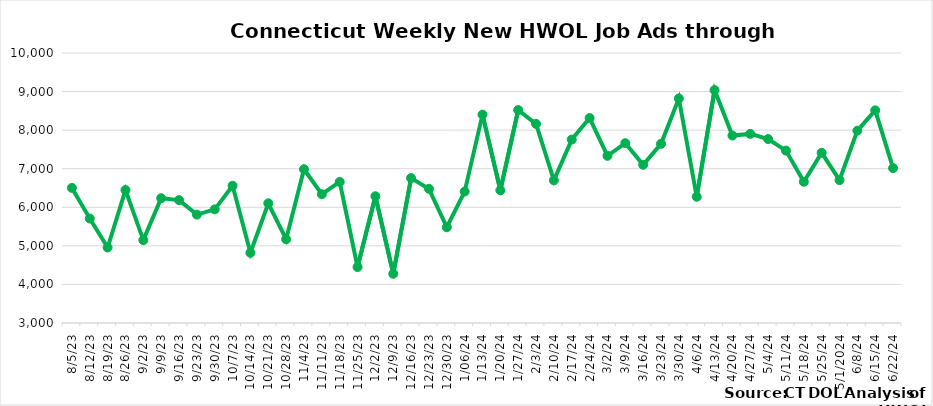
| Category | Connecticut |
|---|---|
| 8/5/23 | 6503 |
| 8/12/23 | 5708 |
| 8/19/23 | 4958 |
| 8/26/23 | 6447 |
| 9/2/23 | 5149 |
| 9/9/23 | 6235 |
| 9/16/23 | 6186 |
| 9/23/23 | 5810 |
| 9/30/23 | 5946 |
| 10/7/23 | 6558 |
| 10/14/23 | 4820 |
| 10/21/23 | 6103 |
| 10/28/23 | 5171 |
| 11/4/23 | 6987 |
| 11/11/23 | 6338 |
| 11/18/23 | 6658 |
| 11/25/23 | 4451 |
| 12/2/23 | 6286 |
| 12/9/23 | 4276 |
| 12/16/23 | 6757 |
|  12/23/23 | 6479 |
|  12/30/23 | 5482 |
|  1/06/24 | 6407 |
|  1/13/24 | 8403 |
|  1/20/24 | 6441 |
|  1/27/24 | 8521 |
|  2/3/24 | 8162 |
|  2/10/24 | 6698 |
|  2/17/24 | 7755 |
|  2/24/24 | 8314 |
|  3/2/24 | 7334 |
|  3/9/24 | 7661 |
|  3/16/24 | 7102 |
|  3/23/24 | 7645 |
|  3/30/24 | 8822 |
|  4/6/24 | 6273 |
|  4/13/24 | 9039 |
|  4/20/24 | 7860 |
|  4/27/24 | 7903 |
|  5/4/24 | 7768 |
|  5/11/24 | 7469 |
|  5/18/24 | 6661 |
|  5/25/24 | 7413 |
| 5/1/2024 | 6704 |
|  6/8/24 | 7987 |
|  6/15/24 | 8513 |
|  6/22/24 | 7015 |